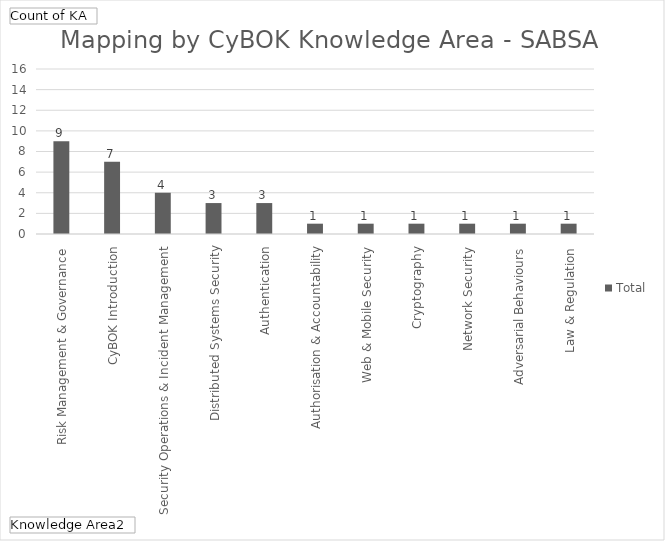
| Category | Total |
|---|---|
| Risk Management & Governance | 9 |
| CyBOK Introduction | 7 |
| Security Operations & Incident Management | 4 |
| Distributed Systems Security | 3 |
| Authentication, Authorisation & Accountability | 3 |
| Web & Mobile Security | 1 |
| Cryptography | 1 |
| Network Security | 1 |
| Adversarial Behaviours | 1 |
| Law & Regulation | 1 |
| Forensics | 1 |